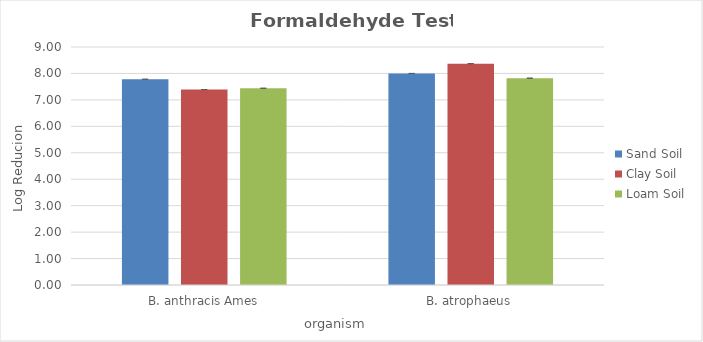
| Category | Sand Soil | Clay Soil | Loam Soil |
|---|---|---|---|
| B. anthracis Ames | 7.78 | 7.39 | 7.44 |
| B. atrophaeus | 8 | 8.37 | 7.82 |